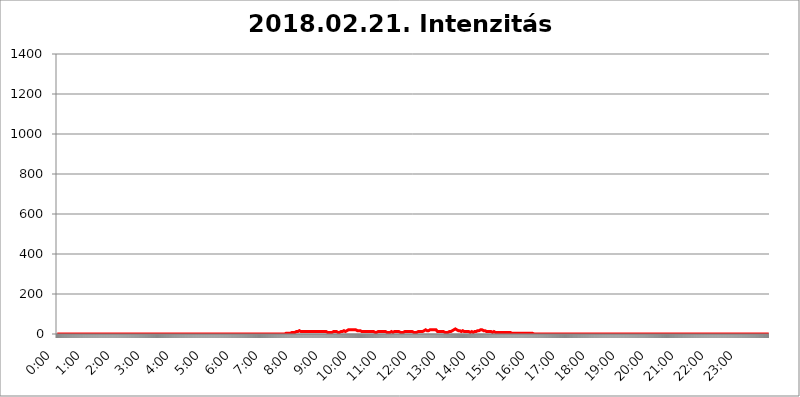
| Category | 2018.02.21. Intenzitás [W/m^2] |
|---|---|
| 0.0 | 0 |
| 0.0006944444444444445 | 0 |
| 0.001388888888888889 | 0 |
| 0.0020833333333333333 | 0 |
| 0.002777777777777778 | 0 |
| 0.003472222222222222 | 0 |
| 0.004166666666666667 | 0 |
| 0.004861111111111111 | 0 |
| 0.005555555555555556 | 0 |
| 0.0062499999999999995 | 0 |
| 0.006944444444444444 | 0 |
| 0.007638888888888889 | 0 |
| 0.008333333333333333 | 0 |
| 0.009027777777777779 | 0 |
| 0.009722222222222222 | 0 |
| 0.010416666666666666 | 0 |
| 0.011111111111111112 | 0 |
| 0.011805555555555555 | 0 |
| 0.012499999999999999 | 0 |
| 0.013194444444444444 | 0 |
| 0.013888888888888888 | 0 |
| 0.014583333333333332 | 0 |
| 0.015277777777777777 | 0 |
| 0.015972222222222224 | 0 |
| 0.016666666666666666 | 0 |
| 0.017361111111111112 | 0 |
| 0.018055555555555557 | 0 |
| 0.01875 | 0 |
| 0.019444444444444445 | 0 |
| 0.02013888888888889 | 0 |
| 0.020833333333333332 | 0 |
| 0.02152777777777778 | 0 |
| 0.022222222222222223 | 0 |
| 0.02291666666666667 | 0 |
| 0.02361111111111111 | 0 |
| 0.024305555555555556 | 0 |
| 0.024999999999999998 | 0 |
| 0.025694444444444447 | 0 |
| 0.02638888888888889 | 0 |
| 0.027083333333333334 | 0 |
| 0.027777777777777776 | 0 |
| 0.02847222222222222 | 0 |
| 0.029166666666666664 | 0 |
| 0.029861111111111113 | 0 |
| 0.030555555555555555 | 0 |
| 0.03125 | 0 |
| 0.03194444444444445 | 0 |
| 0.03263888888888889 | 0 |
| 0.03333333333333333 | 0 |
| 0.034027777777777775 | 0 |
| 0.034722222222222224 | 0 |
| 0.035416666666666666 | 0 |
| 0.036111111111111115 | 0 |
| 0.03680555555555556 | 0 |
| 0.0375 | 0 |
| 0.03819444444444444 | 0 |
| 0.03888888888888889 | 0 |
| 0.03958333333333333 | 0 |
| 0.04027777777777778 | 0 |
| 0.04097222222222222 | 0 |
| 0.041666666666666664 | 0 |
| 0.042361111111111106 | 0 |
| 0.04305555555555556 | 0 |
| 0.043750000000000004 | 0 |
| 0.044444444444444446 | 0 |
| 0.04513888888888889 | 0 |
| 0.04583333333333334 | 0 |
| 0.04652777777777778 | 0 |
| 0.04722222222222222 | 0 |
| 0.04791666666666666 | 0 |
| 0.04861111111111111 | 0 |
| 0.049305555555555554 | 0 |
| 0.049999999999999996 | 0 |
| 0.05069444444444445 | 0 |
| 0.051388888888888894 | 0 |
| 0.052083333333333336 | 0 |
| 0.05277777777777778 | 0 |
| 0.05347222222222222 | 0 |
| 0.05416666666666667 | 0 |
| 0.05486111111111111 | 0 |
| 0.05555555555555555 | 0 |
| 0.05625 | 0 |
| 0.05694444444444444 | 0 |
| 0.057638888888888885 | 0 |
| 0.05833333333333333 | 0 |
| 0.05902777777777778 | 0 |
| 0.059722222222222225 | 0 |
| 0.06041666666666667 | 0 |
| 0.061111111111111116 | 0 |
| 0.06180555555555556 | 0 |
| 0.0625 | 0 |
| 0.06319444444444444 | 0 |
| 0.06388888888888888 | 0 |
| 0.06458333333333334 | 0 |
| 0.06527777777777778 | 0 |
| 0.06597222222222222 | 0 |
| 0.06666666666666667 | 0 |
| 0.06736111111111111 | 0 |
| 0.06805555555555555 | 0 |
| 0.06874999999999999 | 0 |
| 0.06944444444444443 | 0 |
| 0.07013888888888889 | 0 |
| 0.07083333333333333 | 0 |
| 0.07152777777777779 | 0 |
| 0.07222222222222223 | 0 |
| 0.07291666666666667 | 0 |
| 0.07361111111111111 | 0 |
| 0.07430555555555556 | 0 |
| 0.075 | 0 |
| 0.07569444444444444 | 0 |
| 0.0763888888888889 | 0 |
| 0.07708333333333334 | 0 |
| 0.07777777777777778 | 0 |
| 0.07847222222222222 | 0 |
| 0.07916666666666666 | 0 |
| 0.0798611111111111 | 0 |
| 0.08055555555555556 | 0 |
| 0.08125 | 0 |
| 0.08194444444444444 | 0 |
| 0.08263888888888889 | 0 |
| 0.08333333333333333 | 0 |
| 0.08402777777777777 | 0 |
| 0.08472222222222221 | 0 |
| 0.08541666666666665 | 0 |
| 0.08611111111111112 | 0 |
| 0.08680555555555557 | 0 |
| 0.08750000000000001 | 0 |
| 0.08819444444444445 | 0 |
| 0.08888888888888889 | 0 |
| 0.08958333333333333 | 0 |
| 0.09027777777777778 | 0 |
| 0.09097222222222222 | 0 |
| 0.09166666666666667 | 0 |
| 0.09236111111111112 | 0 |
| 0.09305555555555556 | 0 |
| 0.09375 | 0 |
| 0.09444444444444444 | 0 |
| 0.09513888888888888 | 0 |
| 0.09583333333333333 | 0 |
| 0.09652777777777777 | 0 |
| 0.09722222222222222 | 0 |
| 0.09791666666666667 | 0 |
| 0.09861111111111111 | 0 |
| 0.09930555555555555 | 0 |
| 0.09999999999999999 | 0 |
| 0.10069444444444443 | 0 |
| 0.1013888888888889 | 0 |
| 0.10208333333333335 | 0 |
| 0.10277777777777779 | 0 |
| 0.10347222222222223 | 0 |
| 0.10416666666666667 | 0 |
| 0.10486111111111111 | 0 |
| 0.10555555555555556 | 0 |
| 0.10625 | 0 |
| 0.10694444444444444 | 0 |
| 0.1076388888888889 | 0 |
| 0.10833333333333334 | 0 |
| 0.10902777777777778 | 0 |
| 0.10972222222222222 | 0 |
| 0.1111111111111111 | 0 |
| 0.11180555555555556 | 0 |
| 0.11180555555555556 | 0 |
| 0.1125 | 0 |
| 0.11319444444444444 | 0 |
| 0.11388888888888889 | 0 |
| 0.11458333333333333 | 0 |
| 0.11527777777777777 | 0 |
| 0.11597222222222221 | 0 |
| 0.11666666666666665 | 0 |
| 0.1173611111111111 | 0 |
| 0.11805555555555557 | 0 |
| 0.11944444444444445 | 0 |
| 0.12013888888888889 | 0 |
| 0.12083333333333333 | 0 |
| 0.12152777777777778 | 0 |
| 0.12222222222222223 | 0 |
| 0.12291666666666667 | 0 |
| 0.12291666666666667 | 0 |
| 0.12361111111111112 | 0 |
| 0.12430555555555556 | 0 |
| 0.125 | 0 |
| 0.12569444444444444 | 0 |
| 0.12638888888888888 | 0 |
| 0.12708333333333333 | 0 |
| 0.16875 | 0 |
| 0.12847222222222224 | 0 |
| 0.12916666666666668 | 0 |
| 0.12986111111111112 | 0 |
| 0.13055555555555556 | 0 |
| 0.13125 | 0 |
| 0.13194444444444445 | 0 |
| 0.1326388888888889 | 0 |
| 0.13333333333333333 | 0 |
| 0.13402777777777777 | 0 |
| 0.13402777777777777 | 0 |
| 0.13472222222222222 | 0 |
| 0.13541666666666666 | 0 |
| 0.1361111111111111 | 0 |
| 0.13749999999999998 | 0 |
| 0.13819444444444443 | 0 |
| 0.1388888888888889 | 0 |
| 0.13958333333333334 | 0 |
| 0.14027777777777778 | 0 |
| 0.14097222222222222 | 0 |
| 0.14166666666666666 | 0 |
| 0.1423611111111111 | 0 |
| 0.14305555555555557 | 0 |
| 0.14375000000000002 | 0 |
| 0.14444444444444446 | 0 |
| 0.1451388888888889 | 0 |
| 0.1451388888888889 | 0 |
| 0.14652777777777778 | 0 |
| 0.14722222222222223 | 0 |
| 0.14791666666666667 | 0 |
| 0.1486111111111111 | 0 |
| 0.14930555555555555 | 0 |
| 0.15 | 0 |
| 0.15069444444444444 | 0 |
| 0.15138888888888888 | 0 |
| 0.15208333333333332 | 0 |
| 0.15277777777777776 | 0 |
| 0.15347222222222223 | 0 |
| 0.15416666666666667 | 0 |
| 0.15486111111111112 | 0 |
| 0.15555555555555556 | 0 |
| 0.15625 | 0 |
| 0.15694444444444444 | 0 |
| 0.15763888888888888 | 0 |
| 0.15833333333333333 | 0 |
| 0.15902777777777777 | 0 |
| 0.15972222222222224 | 0 |
| 0.16041666666666668 | 0 |
| 0.16111111111111112 | 0 |
| 0.16180555555555556 | 0 |
| 0.1625 | 0 |
| 0.16319444444444445 | 0 |
| 0.1638888888888889 | 0 |
| 0.16458333333333333 | 0 |
| 0.16527777777777777 | 0 |
| 0.16597222222222222 | 0 |
| 0.16666666666666666 | 0 |
| 0.1673611111111111 | 0 |
| 0.16805555555555554 | 0 |
| 0.16874999999999998 | 0 |
| 0.16944444444444443 | 0 |
| 0.17013888888888887 | 0 |
| 0.1708333333333333 | 0 |
| 0.17152777777777775 | 0 |
| 0.17222222222222225 | 0 |
| 0.1729166666666667 | 0 |
| 0.17361111111111113 | 0 |
| 0.17430555555555557 | 0 |
| 0.17500000000000002 | 0 |
| 0.17569444444444446 | 0 |
| 0.1763888888888889 | 0 |
| 0.17708333333333334 | 0 |
| 0.17777777777777778 | 0 |
| 0.17847222222222223 | 0 |
| 0.17916666666666667 | 0 |
| 0.1798611111111111 | 0 |
| 0.18055555555555555 | 0 |
| 0.18125 | 0 |
| 0.18194444444444444 | 0 |
| 0.1826388888888889 | 0 |
| 0.18333333333333335 | 0 |
| 0.1840277777777778 | 0 |
| 0.18472222222222223 | 0 |
| 0.18541666666666667 | 0 |
| 0.18611111111111112 | 0 |
| 0.18680555555555556 | 0 |
| 0.1875 | 0 |
| 0.18819444444444444 | 0 |
| 0.18888888888888888 | 0 |
| 0.18958333333333333 | 0 |
| 0.19027777777777777 | 0 |
| 0.1909722222222222 | 0 |
| 0.19166666666666665 | 0 |
| 0.19236111111111112 | 0 |
| 0.19305555555555554 | 0 |
| 0.19375 | 0 |
| 0.19444444444444445 | 0 |
| 0.1951388888888889 | 0 |
| 0.19583333333333333 | 0 |
| 0.19652777777777777 | 0 |
| 0.19722222222222222 | 0 |
| 0.19791666666666666 | 0 |
| 0.1986111111111111 | 0 |
| 0.19930555555555554 | 0 |
| 0.19999999999999998 | 0 |
| 0.20069444444444443 | 0 |
| 0.20138888888888887 | 0 |
| 0.2020833333333333 | 0 |
| 0.2027777777777778 | 0 |
| 0.2034722222222222 | 0 |
| 0.2041666666666667 | 0 |
| 0.20486111111111113 | 0 |
| 0.20555555555555557 | 0 |
| 0.20625000000000002 | 0 |
| 0.20694444444444446 | 0 |
| 0.2076388888888889 | 0 |
| 0.20833333333333334 | 0 |
| 0.20902777777777778 | 0 |
| 0.20972222222222223 | 0 |
| 0.21041666666666667 | 0 |
| 0.2111111111111111 | 0 |
| 0.21180555555555555 | 0 |
| 0.2125 | 0 |
| 0.21319444444444444 | 0 |
| 0.2138888888888889 | 0 |
| 0.21458333333333335 | 0 |
| 0.2152777777777778 | 0 |
| 0.21597222222222223 | 0 |
| 0.21666666666666667 | 0 |
| 0.21736111111111112 | 0 |
| 0.21805555555555556 | 0 |
| 0.21875 | 0 |
| 0.21944444444444444 | 0 |
| 0.22013888888888888 | 0 |
| 0.22083333333333333 | 0 |
| 0.22152777777777777 | 0 |
| 0.2222222222222222 | 0 |
| 0.22291666666666665 | 0 |
| 0.2236111111111111 | 0 |
| 0.22430555555555556 | 0 |
| 0.225 | 0 |
| 0.22569444444444445 | 0 |
| 0.2263888888888889 | 0 |
| 0.22708333333333333 | 0 |
| 0.22777777777777777 | 0 |
| 0.22847222222222222 | 0 |
| 0.22916666666666666 | 0 |
| 0.2298611111111111 | 0 |
| 0.23055555555555554 | 0 |
| 0.23124999999999998 | 0 |
| 0.23194444444444443 | 0 |
| 0.23263888888888887 | 0 |
| 0.2333333333333333 | 0 |
| 0.2340277777777778 | 0 |
| 0.2347222222222222 | 0 |
| 0.2354166666666667 | 0 |
| 0.23611111111111113 | 0 |
| 0.23680555555555557 | 0 |
| 0.23750000000000002 | 0 |
| 0.23819444444444446 | 0 |
| 0.2388888888888889 | 0 |
| 0.23958333333333334 | 0 |
| 0.24027777777777778 | 0 |
| 0.24097222222222223 | 0 |
| 0.24166666666666667 | 0 |
| 0.2423611111111111 | 0 |
| 0.24305555555555555 | 0 |
| 0.24375 | 0 |
| 0.24444444444444446 | 0 |
| 0.24513888888888888 | 0 |
| 0.24583333333333335 | 0 |
| 0.2465277777777778 | 0 |
| 0.24722222222222223 | 0 |
| 0.24791666666666667 | 0 |
| 0.24861111111111112 | 0 |
| 0.24930555555555556 | 0 |
| 0.25 | 0 |
| 0.25069444444444444 | 0 |
| 0.2513888888888889 | 0 |
| 0.2520833333333333 | 0 |
| 0.25277777777777777 | 0 |
| 0.2534722222222222 | 0 |
| 0.25416666666666665 | 0 |
| 0.2548611111111111 | 0 |
| 0.2555555555555556 | 0 |
| 0.25625000000000003 | 0 |
| 0.2569444444444445 | 0 |
| 0.2576388888888889 | 0 |
| 0.25833333333333336 | 0 |
| 0.2590277777777778 | 0 |
| 0.25972222222222224 | 0 |
| 0.2604166666666667 | 0 |
| 0.2611111111111111 | 0 |
| 0.26180555555555557 | 0 |
| 0.2625 | 0 |
| 0.26319444444444445 | 0 |
| 0.2638888888888889 | 0 |
| 0.26458333333333334 | 0 |
| 0.2652777777777778 | 0 |
| 0.2659722222222222 | 0 |
| 0.26666666666666666 | 0 |
| 0.2673611111111111 | 0 |
| 0.26805555555555555 | 0 |
| 0.26875 | 0 |
| 0.26944444444444443 | 0 |
| 0.2701388888888889 | 0 |
| 0.2708333333333333 | 0 |
| 0.27152777777777776 | 0 |
| 0.2722222222222222 | 0 |
| 0.27291666666666664 | 0 |
| 0.2736111111111111 | 0 |
| 0.2743055555555555 | 0 |
| 0.27499999999999997 | 0 |
| 0.27569444444444446 | 0 |
| 0.27638888888888885 | 0 |
| 0.27708333333333335 | 0 |
| 0.2777777777777778 | 0 |
| 0.27847222222222223 | 0 |
| 0.2791666666666667 | 0 |
| 0.2798611111111111 | 0 |
| 0.28055555555555556 | 0 |
| 0.28125 | 0 |
| 0.28194444444444444 | 0 |
| 0.2826388888888889 | 0 |
| 0.2833333333333333 | 0 |
| 0.28402777777777777 | 0 |
| 0.2847222222222222 | 0 |
| 0.28541666666666665 | 0 |
| 0.28611111111111115 | 0 |
| 0.28680555555555554 | 0 |
| 0.28750000000000003 | 0 |
| 0.2881944444444445 | 0 |
| 0.2888888888888889 | 0 |
| 0.28958333333333336 | 0 |
| 0.2902777777777778 | 0 |
| 0.29097222222222224 | 0 |
| 0.2916666666666667 | 0 |
| 0.2923611111111111 | 0 |
| 0.29305555555555557 | 0 |
| 0.29375 | 0 |
| 0.29444444444444445 | 0 |
| 0.2951388888888889 | 0 |
| 0.29583333333333334 | 0 |
| 0.2965277777777778 | 0 |
| 0.2972222222222222 | 0 |
| 0.29791666666666666 | 0 |
| 0.2986111111111111 | 0 |
| 0.29930555555555555 | 0 |
| 0.3 | 0 |
| 0.30069444444444443 | 0 |
| 0.3013888888888889 | 0 |
| 0.3020833333333333 | 0 |
| 0.30277777777777776 | 0 |
| 0.3034722222222222 | 0 |
| 0.30416666666666664 | 0 |
| 0.3048611111111111 | 0 |
| 0.3055555555555555 | 0 |
| 0.30624999999999997 | 0 |
| 0.3069444444444444 | 0 |
| 0.3076388888888889 | 0 |
| 0.30833333333333335 | 0 |
| 0.3090277777777778 | 0 |
| 0.30972222222222223 | 0 |
| 0.3104166666666667 | 0 |
| 0.3111111111111111 | 0 |
| 0.31180555555555556 | 0 |
| 0.3125 | 0 |
| 0.31319444444444444 | 0 |
| 0.3138888888888889 | 0 |
| 0.3145833333333333 | 0 |
| 0.31527777777777777 | 0 |
| 0.3159722222222222 | 0 |
| 0.31666666666666665 | 0 |
| 0.31736111111111115 | 0 |
| 0.31805555555555554 | 0 |
| 0.31875000000000003 | 0 |
| 0.3194444444444445 | 0 |
| 0.3201388888888889 | 0 |
| 0.32083333333333336 | 3.525 |
| 0.3215277777777778 | 3.525 |
| 0.32222222222222224 | 3.525 |
| 0.3229166666666667 | 3.525 |
| 0.3236111111111111 | 3.525 |
| 0.32430555555555557 | 3.525 |
| 0.325 | 3.525 |
| 0.32569444444444445 | 3.525 |
| 0.3263888888888889 | 3.525 |
| 0.32708333333333334 | 3.525 |
| 0.3277777777777778 | 7.887 |
| 0.3284722222222222 | 7.887 |
| 0.32916666666666666 | 7.887 |
| 0.3298611111111111 | 7.887 |
| 0.33055555555555555 | 7.887 |
| 0.33125 | 7.887 |
| 0.33194444444444443 | 7.887 |
| 0.3326388888888889 | 7.887 |
| 0.3333333333333333 | 7.887 |
| 0.3340277777777778 | 7.887 |
| 0.3347222222222222 | 7.887 |
| 0.3354166666666667 | 12.257 |
| 0.3361111111111111 | 12.257 |
| 0.3368055555555556 | 12.257 |
| 0.33749999999999997 | 12.257 |
| 0.33819444444444446 | 12.257 |
| 0.33888888888888885 | 12.257 |
| 0.33958333333333335 | 16.636 |
| 0.34027777777777773 | 12.257 |
| 0.34097222222222223 | 12.257 |
| 0.3416666666666666 | 12.257 |
| 0.3423611111111111 | 12.257 |
| 0.3430555555555555 | 12.257 |
| 0.34375 | 12.257 |
| 0.3444444444444445 | 12.257 |
| 0.3451388888888889 | 12.257 |
| 0.3458333333333334 | 12.257 |
| 0.34652777777777777 | 12.257 |
| 0.34722222222222227 | 12.257 |
| 0.34791666666666665 | 12.257 |
| 0.34861111111111115 | 12.257 |
| 0.34930555555555554 | 12.257 |
| 0.35000000000000003 | 12.257 |
| 0.3506944444444444 | 12.257 |
| 0.3513888888888889 | 12.257 |
| 0.3520833333333333 | 12.257 |
| 0.3527777777777778 | 12.257 |
| 0.3534722222222222 | 12.257 |
| 0.3541666666666667 | 12.257 |
| 0.3548611111111111 | 12.257 |
| 0.35555555555555557 | 12.257 |
| 0.35625 | 12.257 |
| 0.35694444444444445 | 12.257 |
| 0.3576388888888889 | 12.257 |
| 0.35833333333333334 | 12.257 |
| 0.3590277777777778 | 12.257 |
| 0.3597222222222222 | 12.257 |
| 0.36041666666666666 | 12.257 |
| 0.3611111111111111 | 12.257 |
| 0.36180555555555555 | 12.257 |
| 0.3625 | 12.257 |
| 0.36319444444444443 | 12.257 |
| 0.3638888888888889 | 12.257 |
| 0.3645833333333333 | 12.257 |
| 0.3652777777777778 | 12.257 |
| 0.3659722222222222 | 12.257 |
| 0.3666666666666667 | 12.257 |
| 0.3673611111111111 | 12.257 |
| 0.3680555555555556 | 12.257 |
| 0.36874999999999997 | 12.257 |
| 0.36944444444444446 | 12.257 |
| 0.37013888888888885 | 12.257 |
| 0.37083333333333335 | 12.257 |
| 0.37152777777777773 | 12.257 |
| 0.37222222222222223 | 12.257 |
| 0.3729166666666666 | 12.257 |
| 0.3736111111111111 | 12.257 |
| 0.3743055555555555 | 12.257 |
| 0.375 | 12.257 |
| 0.3756944444444445 | 12.257 |
| 0.3763888888888889 | 12.257 |
| 0.3770833333333334 | 12.257 |
| 0.37777777777777777 | 7.887 |
| 0.37847222222222227 | 7.887 |
| 0.37916666666666665 | 7.887 |
| 0.37986111111111115 | 7.887 |
| 0.38055555555555554 | 7.887 |
| 0.38125000000000003 | 7.887 |
| 0.3819444444444444 | 7.887 |
| 0.3826388888888889 | 7.887 |
| 0.3833333333333333 | 7.887 |
| 0.3840277777777778 | 7.887 |
| 0.3847222222222222 | 7.887 |
| 0.3854166666666667 | 7.887 |
| 0.3861111111111111 | 12.257 |
| 0.38680555555555557 | 12.257 |
| 0.3875 | 12.257 |
| 0.38819444444444445 | 12.257 |
| 0.3888888888888889 | 12.257 |
| 0.38958333333333334 | 12.257 |
| 0.3902777777777778 | 7.887 |
| 0.3909722222222222 | 12.257 |
| 0.39166666666666666 | 12.257 |
| 0.3923611111111111 | 7.887 |
| 0.39305555555555555 | 7.887 |
| 0.39375 | 7.887 |
| 0.39444444444444443 | 7.887 |
| 0.3951388888888889 | 7.887 |
| 0.3958333333333333 | 7.887 |
| 0.3965277777777778 | 7.887 |
| 0.3972222222222222 | 12.257 |
| 0.3979166666666667 | 12.257 |
| 0.3986111111111111 | 12.257 |
| 0.3993055555555556 | 12.257 |
| 0.39999999999999997 | 12.257 |
| 0.40069444444444446 | 12.257 |
| 0.40138888888888885 | 12.257 |
| 0.40208333333333335 | 16.636 |
| 0.40277777777777773 | 16.636 |
| 0.40347222222222223 | 16.636 |
| 0.4041666666666666 | 12.257 |
| 0.4048611111111111 | 16.636 |
| 0.4055555555555555 | 16.636 |
| 0.40625 | 16.636 |
| 0.4069444444444445 | 16.636 |
| 0.4076388888888889 | 16.636 |
| 0.4083333333333334 | 21.024 |
| 0.40902777777777777 | 21.024 |
| 0.40972222222222227 | 21.024 |
| 0.41041666666666665 | 21.024 |
| 0.41111111111111115 | 21.024 |
| 0.41180555555555554 | 21.024 |
| 0.41250000000000003 | 21.024 |
| 0.4131944444444444 | 21.024 |
| 0.4138888888888889 | 21.024 |
| 0.4145833333333333 | 21.024 |
| 0.4152777777777778 | 25.419 |
| 0.4159722222222222 | 25.419 |
| 0.4166666666666667 | 21.024 |
| 0.4173611111111111 | 21.024 |
| 0.41805555555555557 | 21.024 |
| 0.41875 | 21.024 |
| 0.41944444444444445 | 16.636 |
| 0.4201388888888889 | 16.636 |
| 0.42083333333333334 | 16.636 |
| 0.4215277777777778 | 16.636 |
| 0.4222222222222222 | 16.636 |
| 0.42291666666666666 | 16.636 |
| 0.4236111111111111 | 16.636 |
| 0.42430555555555555 | 16.636 |
| 0.425 | 16.636 |
| 0.42569444444444443 | 16.636 |
| 0.4263888888888889 | 12.257 |
| 0.4270833333333333 | 12.257 |
| 0.4277777777777778 | 12.257 |
| 0.4284722222222222 | 12.257 |
| 0.4291666666666667 | 12.257 |
| 0.4298611111111111 | 12.257 |
| 0.4305555555555556 | 12.257 |
| 0.43124999999999997 | 12.257 |
| 0.43194444444444446 | 12.257 |
| 0.43263888888888885 | 12.257 |
| 0.43333333333333335 | 12.257 |
| 0.43402777777777773 | 12.257 |
| 0.43472222222222223 | 12.257 |
| 0.4354166666666666 | 12.257 |
| 0.4361111111111111 | 12.257 |
| 0.4368055555555555 | 12.257 |
| 0.4375 | 12.257 |
| 0.4381944444444445 | 12.257 |
| 0.4388888888888889 | 12.257 |
| 0.4395833333333334 | 12.257 |
| 0.44027777777777777 | 12.257 |
| 0.44097222222222227 | 12.257 |
| 0.44166666666666665 | 12.257 |
| 0.44236111111111115 | 12.257 |
| 0.44305555555555554 | 12.257 |
| 0.44375000000000003 | 12.257 |
| 0.4444444444444444 | 12.257 |
| 0.4451388888888889 | 7.887 |
| 0.4458333333333333 | 7.887 |
| 0.4465277777777778 | 12.257 |
| 0.4472222222222222 | 12.257 |
| 0.4479166666666667 | 7.887 |
| 0.4486111111111111 | 12.257 |
| 0.44930555555555557 | 12.257 |
| 0.45 | 12.257 |
| 0.45069444444444445 | 12.257 |
| 0.4513888888888889 | 7.887 |
| 0.45208333333333334 | 12.257 |
| 0.4527777777777778 | 12.257 |
| 0.4534722222222222 | 12.257 |
| 0.45416666666666666 | 12.257 |
| 0.4548611111111111 | 12.257 |
| 0.45555555555555555 | 12.257 |
| 0.45625 | 12.257 |
| 0.45694444444444443 | 12.257 |
| 0.4576388888888889 | 12.257 |
| 0.4583333333333333 | 12.257 |
| 0.4590277777777778 | 12.257 |
| 0.4597222222222222 | 12.257 |
| 0.4604166666666667 | 12.257 |
| 0.4611111111111111 | 12.257 |
| 0.4618055555555556 | 12.257 |
| 0.46249999999999997 | 7.887 |
| 0.46319444444444446 | 7.887 |
| 0.46388888888888885 | 7.887 |
| 0.46458333333333335 | 7.887 |
| 0.46527777777777773 | 7.887 |
| 0.46597222222222223 | 7.887 |
| 0.4666666666666666 | 7.887 |
| 0.4673611111111111 | 7.887 |
| 0.4680555555555555 | 7.887 |
| 0.46875 | 12.257 |
| 0.4694444444444445 | 7.887 |
| 0.4701388888888889 | 7.887 |
| 0.4708333333333334 | 7.887 |
| 0.47152777777777777 | 7.887 |
| 0.47222222222222227 | 12.257 |
| 0.47291666666666665 | 12.257 |
| 0.47361111111111115 | 7.887 |
| 0.47430555555555554 | 7.887 |
| 0.47500000000000003 | 12.257 |
| 0.4756944444444444 | 12.257 |
| 0.4763888888888889 | 12.257 |
| 0.4770833333333333 | 12.257 |
| 0.4777777777777778 | 12.257 |
| 0.4784722222222222 | 12.257 |
| 0.4791666666666667 | 12.257 |
| 0.4798611111111111 | 12.257 |
| 0.48055555555555557 | 7.887 |
| 0.48125 | 7.887 |
| 0.48194444444444445 | 7.887 |
| 0.4826388888888889 | 7.887 |
| 0.48333333333333334 | 7.887 |
| 0.4840277777777778 | 7.887 |
| 0.4847222222222222 | 7.887 |
| 0.48541666666666666 | 7.887 |
| 0.4861111111111111 | 7.887 |
| 0.48680555555555555 | 12.257 |
| 0.4875 | 12.257 |
| 0.48819444444444443 | 12.257 |
| 0.4888888888888889 | 12.257 |
| 0.4895833333333333 | 12.257 |
| 0.4902777777777778 | 12.257 |
| 0.4909722222222222 | 12.257 |
| 0.4916666666666667 | 12.257 |
| 0.4923611111111111 | 12.257 |
| 0.4930555555555556 | 12.257 |
| 0.49374999999999997 | 12.257 |
| 0.49444444444444446 | 12.257 |
| 0.49513888888888885 | 12.257 |
| 0.49583333333333335 | 12.257 |
| 0.49652777777777773 | 12.257 |
| 0.49722222222222223 | 12.257 |
| 0.4979166666666666 | 12.257 |
| 0.4986111111111111 | 12.257 |
| 0.4993055555555555 | 7.887 |
| 0.5 | 7.887 |
| 0.5006944444444444 | 7.887 |
| 0.5013888888888889 | 7.887 |
| 0.5020833333333333 | 7.887 |
| 0.5027777777777778 | 7.887 |
| 0.5034722222222222 | 12.257 |
| 0.5041666666666667 | 7.887 |
| 0.5048611111111111 | 7.887 |
| 0.5055555555555555 | 7.887 |
| 0.50625 | 12.257 |
| 0.5069444444444444 | 12.257 |
| 0.5076388888888889 | 12.257 |
| 0.5083333333333333 | 12.257 |
| 0.5090277777777777 | 12.257 |
| 0.5097222222222222 | 12.257 |
| 0.5104166666666666 | 12.257 |
| 0.5111111111111112 | 12.257 |
| 0.5118055555555555 | 12.257 |
| 0.5125000000000001 | 12.257 |
| 0.5131944444444444 | 12.257 |
| 0.513888888888889 | 12.257 |
| 0.5145833333333333 | 16.636 |
| 0.5152777777777778 | 16.636 |
| 0.5159722222222222 | 16.636 |
| 0.5166666666666667 | 21.024 |
| 0.517361111111111 | 16.636 |
| 0.5180555555555556 | 16.636 |
| 0.5187499999999999 | 16.636 |
| 0.5194444444444445 | 16.636 |
| 0.5201388888888888 | 16.636 |
| 0.5208333333333334 | 16.636 |
| 0.5215277777777778 | 21.024 |
| 0.5222222222222223 | 21.024 |
| 0.5229166666666667 | 21.024 |
| 0.5236111111111111 | 21.024 |
| 0.5243055555555556 | 21.024 |
| 0.525 | 21.024 |
| 0.5256944444444445 | 21.024 |
| 0.5263888888888889 | 21.024 |
| 0.5270833333333333 | 21.024 |
| 0.5277777777777778 | 21.024 |
| 0.5284722222222222 | 21.024 |
| 0.5291666666666667 | 21.024 |
| 0.5298611111111111 | 21.024 |
| 0.5305555555555556 | 21.024 |
| 0.53125 | 21.024 |
| 0.5319444444444444 | 21.024 |
| 0.5326388888888889 | 16.636 |
| 0.5333333333333333 | 12.257 |
| 0.5340277777777778 | 12.257 |
| 0.5347222222222222 | 12.257 |
| 0.5354166666666667 | 12.257 |
| 0.5361111111111111 | 12.257 |
| 0.5368055555555555 | 12.257 |
| 0.5375 | 12.257 |
| 0.5381944444444444 | 12.257 |
| 0.5388888888888889 | 12.257 |
| 0.5395833333333333 | 12.257 |
| 0.5402777777777777 | 12.257 |
| 0.5409722222222222 | 12.257 |
| 0.5416666666666666 | 12.257 |
| 0.5423611111111112 | 12.257 |
| 0.5430555555555555 | 12.257 |
| 0.5437500000000001 | 7.887 |
| 0.5444444444444444 | 12.257 |
| 0.545138888888889 | 7.887 |
| 0.5458333333333333 | 7.887 |
| 0.5465277777777778 | 12.257 |
| 0.5472222222222222 | 12.257 |
| 0.5479166666666667 | 7.887 |
| 0.548611111111111 | 12.257 |
| 0.5493055555555556 | 12.257 |
| 0.5499999999999999 | 12.257 |
| 0.5506944444444445 | 12.257 |
| 0.5513888888888888 | 12.257 |
| 0.5520833333333334 | 12.257 |
| 0.5527777777777778 | 16.636 |
| 0.5534722222222223 | 16.636 |
| 0.5541666666666667 | 16.636 |
| 0.5548611111111111 | 21.024 |
| 0.5555555555555556 | 21.024 |
| 0.55625 | 21.024 |
| 0.5569444444444445 | 21.024 |
| 0.5576388888888889 | 25.419 |
| 0.5583333333333333 | 25.419 |
| 0.5590277777777778 | 21.024 |
| 0.5597222222222222 | 21.024 |
| 0.5604166666666667 | 21.024 |
| 0.5611111111111111 | 16.636 |
| 0.5618055555555556 | 16.636 |
| 0.5625 | 16.636 |
| 0.5631944444444444 | 12.257 |
| 0.5638888888888889 | 16.636 |
| 0.5645833333333333 | 16.636 |
| 0.5652777777777778 | 16.636 |
| 0.5659722222222222 | 16.636 |
| 0.5666666666666667 | 12.257 |
| 0.5673611111111111 | 12.257 |
| 0.5680555555555555 | 16.636 |
| 0.56875 | 16.636 |
| 0.5694444444444444 | 16.636 |
| 0.5701388888888889 | 12.257 |
| 0.5708333333333333 | 12.257 |
| 0.5715277777777777 | 12.257 |
| 0.5722222222222222 | 12.257 |
| 0.5729166666666666 | 12.257 |
| 0.5736111111111112 | 12.257 |
| 0.5743055555555555 | 12.257 |
| 0.5750000000000001 | 12.257 |
| 0.5756944444444444 | 12.257 |
| 0.576388888888889 | 12.257 |
| 0.5770833333333333 | 12.257 |
| 0.5777777777777778 | 7.887 |
| 0.5784722222222222 | 7.887 |
| 0.5791666666666667 | 7.887 |
| 0.579861111111111 | 7.887 |
| 0.5805555555555556 | 7.887 |
| 0.5812499999999999 | 12.257 |
| 0.5819444444444445 | 7.887 |
| 0.5826388888888888 | 7.887 |
| 0.5833333333333334 | 7.887 |
| 0.5840277777777778 | 7.887 |
| 0.5847222222222223 | 7.887 |
| 0.5854166666666667 | 12.257 |
| 0.5861111111111111 | 12.257 |
| 0.5868055555555556 | 12.257 |
| 0.5875 | 12.257 |
| 0.5881944444444445 | 12.257 |
| 0.5888888888888889 | 12.257 |
| 0.5895833333333333 | 16.636 |
| 0.5902777777777778 | 16.636 |
| 0.5909722222222222 | 16.636 |
| 0.5916666666666667 | 16.636 |
| 0.5923611111111111 | 16.636 |
| 0.5930555555555556 | 16.636 |
| 0.59375 | 21.024 |
| 0.5944444444444444 | 16.636 |
| 0.5951388888888889 | 16.636 |
| 0.5958333333333333 | 21.024 |
| 0.5965277777777778 | 16.636 |
| 0.5972222222222222 | 16.636 |
| 0.5979166666666667 | 16.636 |
| 0.5986111111111111 | 16.636 |
| 0.5993055555555555 | 16.636 |
| 0.6 | 16.636 |
| 0.6006944444444444 | 16.636 |
| 0.6013888888888889 | 12.257 |
| 0.6020833333333333 | 12.257 |
| 0.6027777777777777 | 12.257 |
| 0.6034722222222222 | 12.257 |
| 0.6041666666666666 | 12.257 |
| 0.6048611111111112 | 12.257 |
| 0.6055555555555555 | 12.257 |
| 0.6062500000000001 | 12.257 |
| 0.6069444444444444 | 12.257 |
| 0.607638888888889 | 12.257 |
| 0.6083333333333333 | 12.257 |
| 0.6090277777777778 | 7.887 |
| 0.6097222222222222 | 12.257 |
| 0.6104166666666667 | 7.887 |
| 0.611111111111111 | 12.257 |
| 0.6118055555555556 | 12.257 |
| 0.6124999999999999 | 12.257 |
| 0.6131944444444445 | 7.887 |
| 0.6138888888888888 | 7.887 |
| 0.6145833333333334 | 7.887 |
| 0.6152777777777778 | 7.887 |
| 0.6159722222222223 | 7.887 |
| 0.6166666666666667 | 7.887 |
| 0.6173611111111111 | 7.887 |
| 0.6180555555555556 | 7.887 |
| 0.61875 | 7.887 |
| 0.6194444444444445 | 7.887 |
| 0.6201388888888889 | 7.887 |
| 0.6208333333333333 | 7.887 |
| 0.6215277777777778 | 7.887 |
| 0.6222222222222222 | 7.887 |
| 0.6229166666666667 | 7.887 |
| 0.6236111111111111 | 7.887 |
| 0.6243055555555556 | 7.887 |
| 0.625 | 7.887 |
| 0.6256944444444444 | 7.887 |
| 0.6263888888888889 | 7.887 |
| 0.6270833333333333 | 7.887 |
| 0.6277777777777778 | 7.887 |
| 0.6284722222222222 | 7.887 |
| 0.6291666666666667 | 7.887 |
| 0.6298611111111111 | 7.887 |
| 0.6305555555555555 | 7.887 |
| 0.63125 | 7.887 |
| 0.6319444444444444 | 7.887 |
| 0.6326388888888889 | 3.525 |
| 0.6333333333333333 | 7.887 |
| 0.6340277777777777 | 7.887 |
| 0.6347222222222222 | 7.887 |
| 0.6354166666666666 | 7.887 |
| 0.6361111111111112 | 3.525 |
| 0.6368055555555555 | 3.525 |
| 0.6375000000000001 | 3.525 |
| 0.6381944444444444 | 3.525 |
| 0.638888888888889 | 3.525 |
| 0.6395833333333333 | 3.525 |
| 0.6402777777777778 | 3.525 |
| 0.6409722222222222 | 3.525 |
| 0.6416666666666667 | 3.525 |
| 0.642361111111111 | 3.525 |
| 0.6430555555555556 | 3.525 |
| 0.6437499999999999 | 3.525 |
| 0.6444444444444445 | 3.525 |
| 0.6451388888888888 | 3.525 |
| 0.6458333333333334 | 3.525 |
| 0.6465277777777778 | 3.525 |
| 0.6472222222222223 | 3.525 |
| 0.6479166666666667 | 3.525 |
| 0.6486111111111111 | 3.525 |
| 0.6493055555555556 | 3.525 |
| 0.65 | 3.525 |
| 0.6506944444444445 | 3.525 |
| 0.6513888888888889 | 3.525 |
| 0.6520833333333333 | 3.525 |
| 0.6527777777777778 | 3.525 |
| 0.6534722222222222 | 3.525 |
| 0.6541666666666667 | 3.525 |
| 0.6548611111111111 | 3.525 |
| 0.6555555555555556 | 3.525 |
| 0.65625 | 3.525 |
| 0.6569444444444444 | 3.525 |
| 0.6576388888888889 | 3.525 |
| 0.6583333333333333 | 3.525 |
| 0.6590277777777778 | 3.525 |
| 0.6597222222222222 | 3.525 |
| 0.6604166666666667 | 3.525 |
| 0.6611111111111111 | 3.525 |
| 0.6618055555555555 | 3.525 |
| 0.6625 | 3.525 |
| 0.6631944444444444 | 3.525 |
| 0.6638888888888889 | 3.525 |
| 0.6645833333333333 | 3.525 |
| 0.6652777777777777 | 3.525 |
| 0.6659722222222222 | 3.525 |
| 0.6666666666666666 | 3.525 |
| 0.6673611111111111 | 0 |
| 0.6680555555555556 | 0 |
| 0.6687500000000001 | 0 |
| 0.6694444444444444 | 0 |
| 0.6701388888888888 | 0 |
| 0.6708333333333334 | 0 |
| 0.6715277777777778 | 0 |
| 0.6722222222222222 | 0 |
| 0.6729166666666666 | 0 |
| 0.6736111111111112 | 0 |
| 0.6743055555555556 | 0 |
| 0.6749999999999999 | 0 |
| 0.6756944444444444 | 0 |
| 0.6763888888888889 | 0 |
| 0.6770833333333334 | 0 |
| 0.6777777777777777 | 0 |
| 0.6784722222222223 | 0 |
| 0.6791666666666667 | 0 |
| 0.6798611111111111 | 0 |
| 0.6805555555555555 | 0 |
| 0.68125 | 0 |
| 0.6819444444444445 | 0 |
| 0.6826388888888889 | 0 |
| 0.6833333333333332 | 0 |
| 0.6840277777777778 | 0 |
| 0.6847222222222222 | 0 |
| 0.6854166666666667 | 0 |
| 0.686111111111111 | 0 |
| 0.6868055555555556 | 0 |
| 0.6875 | 0 |
| 0.6881944444444444 | 0 |
| 0.688888888888889 | 0 |
| 0.6895833333333333 | 0 |
| 0.6902777777777778 | 0 |
| 0.6909722222222222 | 0 |
| 0.6916666666666668 | 0 |
| 0.6923611111111111 | 0 |
| 0.6930555555555555 | 0 |
| 0.69375 | 0 |
| 0.6944444444444445 | 0 |
| 0.6951388888888889 | 0 |
| 0.6958333333333333 | 0 |
| 0.6965277777777777 | 0 |
| 0.6972222222222223 | 0 |
| 0.6979166666666666 | 0 |
| 0.6986111111111111 | 0 |
| 0.6993055555555556 | 0 |
| 0.7000000000000001 | 0 |
| 0.7006944444444444 | 0 |
| 0.7013888888888888 | 0 |
| 0.7020833333333334 | 0 |
| 0.7027777777777778 | 0 |
| 0.7034722222222222 | 0 |
| 0.7041666666666666 | 0 |
| 0.7048611111111112 | 0 |
| 0.7055555555555556 | 0 |
| 0.7062499999999999 | 0 |
| 0.7069444444444444 | 0 |
| 0.7076388888888889 | 0 |
| 0.7083333333333334 | 0 |
| 0.7090277777777777 | 0 |
| 0.7097222222222223 | 0 |
| 0.7104166666666667 | 0 |
| 0.7111111111111111 | 0 |
| 0.7118055555555555 | 0 |
| 0.7125 | 0 |
| 0.7131944444444445 | 0 |
| 0.7138888888888889 | 0 |
| 0.7145833333333332 | 0 |
| 0.7152777777777778 | 0 |
| 0.7159722222222222 | 0 |
| 0.7166666666666667 | 0 |
| 0.717361111111111 | 0 |
| 0.7180555555555556 | 0 |
| 0.71875 | 0 |
| 0.7194444444444444 | 0 |
| 0.720138888888889 | 0 |
| 0.7208333333333333 | 0 |
| 0.7215277777777778 | 0 |
| 0.7222222222222222 | 0 |
| 0.7229166666666668 | 0 |
| 0.7236111111111111 | 0 |
| 0.7243055555555555 | 0 |
| 0.725 | 0 |
| 0.7256944444444445 | 0 |
| 0.7263888888888889 | 0 |
| 0.7270833333333333 | 0 |
| 0.7277777777777777 | 0 |
| 0.7284722222222223 | 0 |
| 0.7291666666666666 | 0 |
| 0.7298611111111111 | 0 |
| 0.7305555555555556 | 0 |
| 0.7312500000000001 | 0 |
| 0.7319444444444444 | 0 |
| 0.7326388888888888 | 0 |
| 0.7333333333333334 | 0 |
| 0.7340277777777778 | 0 |
| 0.7347222222222222 | 0 |
| 0.7354166666666666 | 0 |
| 0.7361111111111112 | 0 |
| 0.7368055555555556 | 0 |
| 0.7374999999999999 | 0 |
| 0.7381944444444444 | 0 |
| 0.7388888888888889 | 0 |
| 0.7395833333333334 | 0 |
| 0.7402777777777777 | 0 |
| 0.7409722222222223 | 0 |
| 0.7416666666666667 | 0 |
| 0.7423611111111111 | 0 |
| 0.7430555555555555 | 0 |
| 0.74375 | 0 |
| 0.7444444444444445 | 0 |
| 0.7451388888888889 | 0 |
| 0.7458333333333332 | 0 |
| 0.7465277777777778 | 0 |
| 0.7472222222222222 | 0 |
| 0.7479166666666667 | 0 |
| 0.748611111111111 | 0 |
| 0.7493055555555556 | 0 |
| 0.75 | 0 |
| 0.7506944444444444 | 0 |
| 0.751388888888889 | 0 |
| 0.7520833333333333 | 0 |
| 0.7527777777777778 | 0 |
| 0.7534722222222222 | 0 |
| 0.7541666666666668 | 0 |
| 0.7548611111111111 | 0 |
| 0.7555555555555555 | 0 |
| 0.75625 | 0 |
| 0.7569444444444445 | 0 |
| 0.7576388888888889 | 0 |
| 0.7583333333333333 | 0 |
| 0.7590277777777777 | 0 |
| 0.7597222222222223 | 0 |
| 0.7604166666666666 | 0 |
| 0.7611111111111111 | 0 |
| 0.7618055555555556 | 0 |
| 0.7625000000000001 | 0 |
| 0.7631944444444444 | 0 |
| 0.7638888888888888 | 0 |
| 0.7645833333333334 | 0 |
| 0.7652777777777778 | 0 |
| 0.7659722222222222 | 0 |
| 0.7666666666666666 | 0 |
| 0.7673611111111112 | 0 |
| 0.7680555555555556 | 0 |
| 0.7687499999999999 | 0 |
| 0.7694444444444444 | 0 |
| 0.7701388888888889 | 0 |
| 0.7708333333333334 | 0 |
| 0.7715277777777777 | 0 |
| 0.7722222222222223 | 0 |
| 0.7729166666666667 | 0 |
| 0.7736111111111111 | 0 |
| 0.7743055555555555 | 0 |
| 0.775 | 0 |
| 0.7756944444444445 | 0 |
| 0.7763888888888889 | 0 |
| 0.7770833333333332 | 0 |
| 0.7777777777777778 | 0 |
| 0.7784722222222222 | 0 |
| 0.7791666666666667 | 0 |
| 0.779861111111111 | 0 |
| 0.7805555555555556 | 0 |
| 0.78125 | 0 |
| 0.7819444444444444 | 0 |
| 0.782638888888889 | 0 |
| 0.7833333333333333 | 0 |
| 0.7840277777777778 | 0 |
| 0.7847222222222222 | 0 |
| 0.7854166666666668 | 0 |
| 0.7861111111111111 | 0 |
| 0.7868055555555555 | 0 |
| 0.7875 | 0 |
| 0.7881944444444445 | 0 |
| 0.7888888888888889 | 0 |
| 0.7895833333333333 | 0 |
| 0.7902777777777777 | 0 |
| 0.7909722222222223 | 0 |
| 0.7916666666666666 | 0 |
| 0.7923611111111111 | 0 |
| 0.7930555555555556 | 0 |
| 0.7937500000000001 | 0 |
| 0.7944444444444444 | 0 |
| 0.7951388888888888 | 0 |
| 0.7958333333333334 | 0 |
| 0.7965277777777778 | 0 |
| 0.7972222222222222 | 0 |
| 0.7979166666666666 | 0 |
| 0.7986111111111112 | 0 |
| 0.7993055555555556 | 0 |
| 0.7999999999999999 | 0 |
| 0.8006944444444444 | 0 |
| 0.8013888888888889 | 0 |
| 0.8020833333333334 | 0 |
| 0.8027777777777777 | 0 |
| 0.8034722222222223 | 0 |
| 0.8041666666666667 | 0 |
| 0.8048611111111111 | 0 |
| 0.8055555555555555 | 0 |
| 0.80625 | 0 |
| 0.8069444444444445 | 0 |
| 0.8076388888888889 | 0 |
| 0.8083333333333332 | 0 |
| 0.8090277777777778 | 0 |
| 0.8097222222222222 | 0 |
| 0.8104166666666667 | 0 |
| 0.811111111111111 | 0 |
| 0.8118055555555556 | 0 |
| 0.8125 | 0 |
| 0.8131944444444444 | 0 |
| 0.813888888888889 | 0 |
| 0.8145833333333333 | 0 |
| 0.8152777777777778 | 0 |
| 0.8159722222222222 | 0 |
| 0.8166666666666668 | 0 |
| 0.8173611111111111 | 0 |
| 0.8180555555555555 | 0 |
| 0.81875 | 0 |
| 0.8194444444444445 | 0 |
| 0.8201388888888889 | 0 |
| 0.8208333333333333 | 0 |
| 0.8215277777777777 | 0 |
| 0.8222222222222223 | 0 |
| 0.8229166666666666 | 0 |
| 0.8236111111111111 | 0 |
| 0.8243055555555556 | 0 |
| 0.8250000000000001 | 0 |
| 0.8256944444444444 | 0 |
| 0.8263888888888888 | 0 |
| 0.8270833333333334 | 0 |
| 0.8277777777777778 | 0 |
| 0.8284722222222222 | 0 |
| 0.8291666666666666 | 0 |
| 0.8298611111111112 | 0 |
| 0.8305555555555556 | 0 |
| 0.8312499999999999 | 0 |
| 0.8319444444444444 | 0 |
| 0.8326388888888889 | 0 |
| 0.8333333333333334 | 0 |
| 0.8340277777777777 | 0 |
| 0.8347222222222223 | 0 |
| 0.8354166666666667 | 0 |
| 0.8361111111111111 | 0 |
| 0.8368055555555555 | 0 |
| 0.8375 | 0 |
| 0.8381944444444445 | 0 |
| 0.8388888888888889 | 0 |
| 0.8395833333333332 | 0 |
| 0.8402777777777778 | 0 |
| 0.8409722222222222 | 0 |
| 0.8416666666666667 | 0 |
| 0.842361111111111 | 0 |
| 0.8430555555555556 | 0 |
| 0.84375 | 0 |
| 0.8444444444444444 | 0 |
| 0.845138888888889 | 0 |
| 0.8458333333333333 | 0 |
| 0.8465277777777778 | 0 |
| 0.8472222222222222 | 0 |
| 0.8479166666666668 | 0 |
| 0.8486111111111111 | 0 |
| 0.8493055555555555 | 0 |
| 0.85 | 0 |
| 0.8506944444444445 | 0 |
| 0.8513888888888889 | 0 |
| 0.8520833333333333 | 0 |
| 0.8527777777777777 | 0 |
| 0.8534722222222223 | 0 |
| 0.8541666666666666 | 0 |
| 0.8548611111111111 | 0 |
| 0.8555555555555556 | 0 |
| 0.8562500000000001 | 0 |
| 0.8569444444444444 | 0 |
| 0.8576388888888888 | 0 |
| 0.8583333333333334 | 0 |
| 0.8590277777777778 | 0 |
| 0.8597222222222222 | 0 |
| 0.8604166666666666 | 0 |
| 0.8611111111111112 | 0 |
| 0.8618055555555556 | 0 |
| 0.8624999999999999 | 0 |
| 0.8631944444444444 | 0 |
| 0.8638888888888889 | 0 |
| 0.8645833333333334 | 0 |
| 0.8652777777777777 | 0 |
| 0.8659722222222223 | 0 |
| 0.8666666666666667 | 0 |
| 0.8673611111111111 | 0 |
| 0.8680555555555555 | 0 |
| 0.86875 | 0 |
| 0.8694444444444445 | 0 |
| 0.8701388888888889 | 0 |
| 0.8708333333333332 | 0 |
| 0.8715277777777778 | 0 |
| 0.8722222222222222 | 0 |
| 0.8729166666666667 | 0 |
| 0.873611111111111 | 0 |
| 0.8743055555555556 | 0 |
| 0.875 | 0 |
| 0.8756944444444444 | 0 |
| 0.876388888888889 | 0 |
| 0.8770833333333333 | 0 |
| 0.8777777777777778 | 0 |
| 0.8784722222222222 | 0 |
| 0.8791666666666668 | 0 |
| 0.8798611111111111 | 0 |
| 0.8805555555555555 | 0 |
| 0.88125 | 0 |
| 0.8819444444444445 | 0 |
| 0.8826388888888889 | 0 |
| 0.8833333333333333 | 0 |
| 0.8840277777777777 | 0 |
| 0.8847222222222223 | 0 |
| 0.8854166666666666 | 0 |
| 0.8861111111111111 | 0 |
| 0.8868055555555556 | 0 |
| 0.8875000000000001 | 0 |
| 0.8881944444444444 | 0 |
| 0.8888888888888888 | 0 |
| 0.8895833333333334 | 0 |
| 0.8902777777777778 | 0 |
| 0.8909722222222222 | 0 |
| 0.8916666666666666 | 0 |
| 0.8923611111111112 | 0 |
| 0.8930555555555556 | 0 |
| 0.8937499999999999 | 0 |
| 0.8944444444444444 | 0 |
| 0.8951388888888889 | 0 |
| 0.8958333333333334 | 0 |
| 0.8965277777777777 | 0 |
| 0.8972222222222223 | 0 |
| 0.8979166666666667 | 0 |
| 0.8986111111111111 | 0 |
| 0.8993055555555555 | 0 |
| 0.9 | 0 |
| 0.9006944444444445 | 0 |
| 0.9013888888888889 | 0 |
| 0.9020833333333332 | 0 |
| 0.9027777777777778 | 0 |
| 0.9034722222222222 | 0 |
| 0.9041666666666667 | 0 |
| 0.904861111111111 | 0 |
| 0.9055555555555556 | 0 |
| 0.90625 | 0 |
| 0.9069444444444444 | 0 |
| 0.907638888888889 | 0 |
| 0.9083333333333333 | 0 |
| 0.9090277777777778 | 0 |
| 0.9097222222222222 | 0 |
| 0.9104166666666668 | 0 |
| 0.9111111111111111 | 0 |
| 0.9118055555555555 | 0 |
| 0.9125 | 0 |
| 0.9131944444444445 | 0 |
| 0.9138888888888889 | 0 |
| 0.9145833333333333 | 0 |
| 0.9152777777777777 | 0 |
| 0.9159722222222223 | 0 |
| 0.9166666666666666 | 0 |
| 0.9173611111111111 | 0 |
| 0.9180555555555556 | 0 |
| 0.9187500000000001 | 0 |
| 0.9194444444444444 | 0 |
| 0.9201388888888888 | 0 |
| 0.9208333333333334 | 0 |
| 0.9215277777777778 | 0 |
| 0.9222222222222222 | 0 |
| 0.9229166666666666 | 0 |
| 0.9236111111111112 | 0 |
| 0.9243055555555556 | 0 |
| 0.9249999999999999 | 0 |
| 0.9256944444444444 | 0 |
| 0.9263888888888889 | 0 |
| 0.9270833333333334 | 0 |
| 0.9277777777777777 | 0 |
| 0.9284722222222223 | 0 |
| 0.9291666666666667 | 0 |
| 0.9298611111111111 | 0 |
| 0.9305555555555555 | 0 |
| 0.93125 | 0 |
| 0.9319444444444445 | 0 |
| 0.9326388888888889 | 0 |
| 0.9333333333333332 | 0 |
| 0.9340277777777778 | 0 |
| 0.9347222222222222 | 0 |
| 0.9354166666666667 | 0 |
| 0.936111111111111 | 0 |
| 0.9368055555555556 | 0 |
| 0.9375 | 0 |
| 0.9381944444444444 | 0 |
| 0.938888888888889 | 0 |
| 0.9395833333333333 | 0 |
| 0.9402777777777778 | 0 |
| 0.9409722222222222 | 0 |
| 0.9416666666666668 | 0 |
| 0.9423611111111111 | 0 |
| 0.9430555555555555 | 0 |
| 0.94375 | 0 |
| 0.9444444444444445 | 0 |
| 0.9451388888888889 | 0 |
| 0.9458333333333333 | 0 |
| 0.9465277777777777 | 0 |
| 0.9472222222222223 | 0 |
| 0.9479166666666666 | 0 |
| 0.9486111111111111 | 0 |
| 0.9493055555555556 | 0 |
| 0.9500000000000001 | 0 |
| 0.9506944444444444 | 0 |
| 0.9513888888888888 | 0 |
| 0.9520833333333334 | 0 |
| 0.9527777777777778 | 0 |
| 0.9534722222222222 | 0 |
| 0.9541666666666666 | 0 |
| 0.9548611111111112 | 0 |
| 0.9555555555555556 | 0 |
| 0.9562499999999999 | 0 |
| 0.9569444444444444 | 0 |
| 0.9576388888888889 | 0 |
| 0.9583333333333334 | 0 |
| 0.9590277777777777 | 0 |
| 0.9597222222222223 | 0 |
| 0.9604166666666667 | 0 |
| 0.9611111111111111 | 0 |
| 0.9618055555555555 | 0 |
| 0.9625 | 0 |
| 0.9631944444444445 | 0 |
| 0.9638888888888889 | 0 |
| 0.9645833333333332 | 0 |
| 0.9652777777777778 | 0 |
| 0.9659722222222222 | 0 |
| 0.9666666666666667 | 0 |
| 0.967361111111111 | 0 |
| 0.9680555555555556 | 0 |
| 0.96875 | 0 |
| 0.9694444444444444 | 0 |
| 0.970138888888889 | 0 |
| 0.9708333333333333 | 0 |
| 0.9715277777777778 | 0 |
| 0.9722222222222222 | 0 |
| 0.9729166666666668 | 0 |
| 0.9736111111111111 | 0 |
| 0.9743055555555555 | 0 |
| 0.975 | 0 |
| 0.9756944444444445 | 0 |
| 0.9763888888888889 | 0 |
| 0.9770833333333333 | 0 |
| 0.9777777777777777 | 0 |
| 0.9784722222222223 | 0 |
| 0.9791666666666666 | 0 |
| 0.9798611111111111 | 0 |
| 0.9805555555555556 | 0 |
| 0.9812500000000001 | 0 |
| 0.9819444444444444 | 0 |
| 0.9826388888888888 | 0 |
| 0.9833333333333334 | 0 |
| 0.9840277777777778 | 0 |
| 0.9847222222222222 | 0 |
| 0.9854166666666666 | 0 |
| 0.9861111111111112 | 0 |
| 0.9868055555555556 | 0 |
| 0.9874999999999999 | 0 |
| 0.9881944444444444 | 0 |
| 0.9888888888888889 | 0 |
| 0.9895833333333334 | 0 |
| 0.9902777777777777 | 0 |
| 0.9909722222222223 | 0 |
| 0.9916666666666667 | 0 |
| 0.9923611111111111 | 0 |
| 0.9930555555555555 | 0 |
| 0.99375 | 0 |
| 0.9944444444444445 | 0 |
| 0.9951388888888889 | 0 |
| 0.9958333333333332 | 0 |
| 0.9965277777777778 | 0 |
| 0.9972222222222222 | 0 |
| 0.9979166666666667 | 0 |
| 0.998611111111111 | 0 |
| 0.9993055555555556 | 0 |